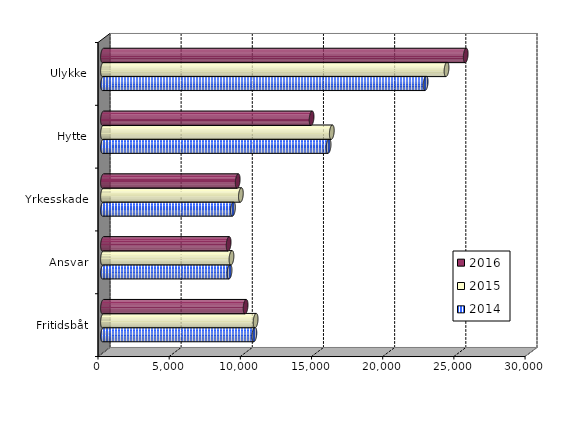
| Category | 2014 | 2015 | 2016 |
|---|---|---|---|
| Fritidsbåt | 10634 | 10720.655 | 10018.849 |
| Ansvar | 8890 | 9026 | 8825.393 |
| Yrkesskade | 9129 | 9685 | 9463 |
| Hytte | 15847 | 16072.498 | 14653.807 |
| Ulykke | 22664 | 24133 | 25480.007 |